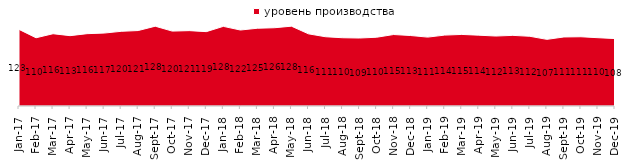
| Category | уровень производства |
|---|---|
| 2017-01-01 | 122.95 |
| 2017-02-01 | 109.5 |
| 2017-03-01 | 116 |
| 2017-04-01 | 112.9 |
| 2017-05-01 | 116.1 |
| 2017-06-01 | 117.05 |
| 2017-07-01 | 119.85 |
| 2017-08-01 | 121.1 |
| 2017-09-01 | 128.05 |
| 2017-10-01 | 120.2 |
| 2017-11-01 | 120.95 |
| 2017-12-01 | 119.35 |
| 2018-01-01 | 127.8 |
| 2018-02-01 | 121.95 |
| 2018-03-01 | 124.8 |
| 2018-04-01 | 125.6 |
| 2018-05-01 | 128.1 |
| 2018-06-01 | 115.8 |
| 2018-07-01 | 111.15 |
| 2018-08-01 | 109.55 |
| 2018-09-01 | 109.1 |
| 2018-10-01 | 110.35 |
| 2018-11-01 | 114.721 |
| 2018-12-01 | 113.1 |
| 2019-01-01 | 110.55 |
| 2019-02-01 | 113.8 |
| 2019-03-01 | 114.868 |
| 2019-04-01 | 113.663 |
| 2019-05-01 | 112.283 |
| 2019-06-01 | 113.367 |
| 2019-07-01 | 111.881 |
| 2019-08-01 | 106.943 |
| 2019-09-01 | 110.792 |
| 2019-10-01 | 111.139 |
| 2019-11-01 | 109.604 |
| 2019-12-01 | 108.218 |